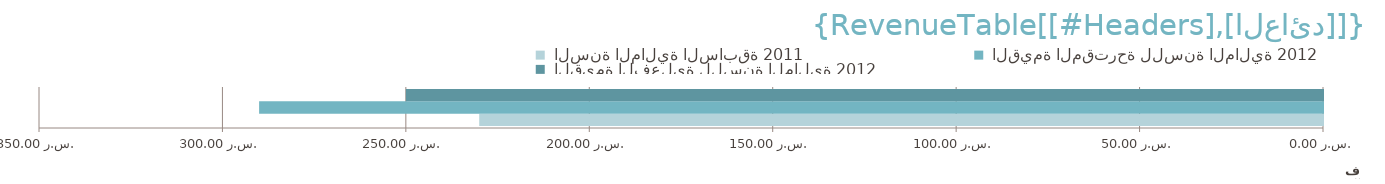
| Category |  السنة المالية السابقة 2011 |  القيمة المقترحة للسنة المالية 2012 |  القيمة الفعلية للسنة المالية 2012 |
|---|---|---|---|
| 0 | 230000 | 290000 | 250000 |